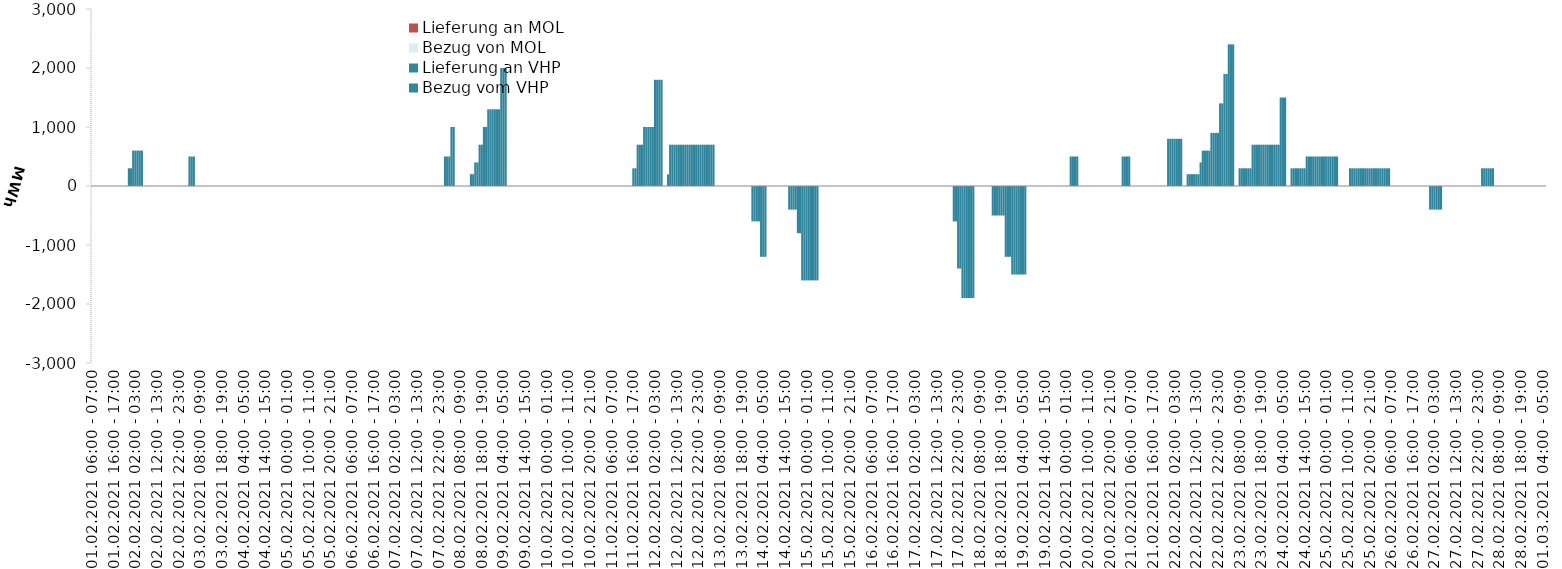
| Category | Bezug vom VHP | Lieferung an VHP | Bezug von MOL | Lieferung an MOL |
|---|---|---|---|---|
| 01.02.2021 06:00 - 07:00 | 0 | 0 | 0 | 0 |
| 01.02.2021 07:00 - 08:00 | 0 | 0 | 0 | 0 |
| 01.02.2021 08:00 - 09:00 | 0 | 0 | 0 | 0 |
| 01.02.2021 09:00 - 10:00 | 0 | 0 | 0 | 0 |
| 01.02.2021 10:00 - 11:00 | 0 | 0 | 0 | 0 |
| 01.02.2021 11:00 - 12:00 | 0 | 0 | 0 | 0 |
| 01.02.2021 12:00 - 13:00 | 0 | 0 | 0 | 0 |
| 01.02.2021 13:00 - 14:00 | 0 | 0 | 0 | 0 |
| 01.02.2021 14:00 - 15:00 | 0 | 0 | 0 | 0 |
| 01.02.2021 15:00 - 16:00 | 0 | 0 | 0 | 0 |
| 01.02.2021 16:00 - 17:00 | 0 | 0 | 0 | 0 |
| 01.02.2021 17:00 - 18:00 | 0 | 0 | 0 | 0 |
| 01.02.2021 18:00 - 19:00 | 0 | 0 | 0 | 0 |
| 01.02.2021 19:00 - 20:00 | 0 | 0 | 0 | 0 |
| 01.02.2021 20:00 - 21:00 | 0 | 0 | 0 | 0 |
| 01.02.2021 21:00 - 22:00 | 0 | 0 | 0 | 0 |
| 01.02.2021 22:00 - 23:00 | 0 | 0 | 0 | 0 |
| 01.02.2021 23:00 - 24:00 | 300 | 0 | 0 | 0 |
| 02.02.2021 00:00 - 01:00 | 300 | 0 | 0 | 0 |
| 02.02.2021 01:00 - 02:00 | 600 | 0 | 0 | 0 |
| 02.02.2021 02:00 - 03:00 | 600 | 0 | 0 | 0 |
| 02.02.2021 03:00 - 04:00 | 600 | 0 | 0 | 0 |
| 02.02.2021 04:00 - 05:00 | 600 | 0 | 0 | 0 |
| 02.02.2021 05:00 - 06:00 | 600 | 0 | 0 | 0 |
| 02.02.2021 06:00 - 07:00 | 0 | 0 | 0 | 0 |
| 02.02.2021 07:00 - 08:00 | 0 | 0 | 0 | 0 |
| 02.02.2021 08:00 - 09:00 | 0 | 0 | 0 | 0 |
| 02.02.2021 09:00 - 10:00 | 0 | 0 | 0 | 0 |
| 02.02.2021 10:00 - 11:00 | 0 | 0 | 0 | 0 |
| 02.02.2021 11:00 - 12:00 | 0 | 0 | 0 | 0 |
| 02.02.2021 12:00 - 13:00 | 0 | 0 | 0 | 0 |
| 02.02.2021 13:00 - 14:00 | 0 | 0 | 0 | 0 |
| 02.02.2021 14:00 - 15:00 | 0 | 0 | 0 | 0 |
| 02.02.2021 15:00 - 16:00 | 0 | 0 | 0 | 0 |
| 02.02.2021 16:00 - 17:00 | 0 | 0 | 0 | 0 |
| 02.02.2021 17:00 - 18:00 | 0 | 0 | 0 | 0 |
| 02.02.2021 18:00 - 19:00 | 0 | 0 | 0 | 0 |
| 02.02.2021 19:00 - 20:00 | 0 | 0 | 0 | 0 |
| 02.02.2021 20:00 - 21:00 | 0 | 0 | 0 | 0 |
| 02.02.2021 21:00 - 22:00 | 0 | 0 | 0 | 0 |
| 02.02.2021 22:00 - 23:00 | 0 | 0 | 0 | 0 |
| 02.02.2021 23:00 - 24:00 | 0 | 0 | 0 | 0 |
| 03.02.2021 00:00 - 01:00 | 0 | 0 | 0 | 0 |
| 03.02.2021 01:00 - 02:00 | 0 | 0 | 0 | 0 |
| 03.02.2021 02:00 - 03:00 | 0 | 0 | 0 | 0 |
| 03.02.2021 03:00 - 04:00 | 500 | 0 | 0 | 0 |
| 03.02.2021 04:00 - 05:00 | 500 | 0 | 0 | 0 |
| 03.02.2021 05:00 - 06:00 | 500 | 0 | 0 | 0 |
| 03.02.2021 06:00 - 07:00 | 0 | 0 | 0 | 0 |
| 03.02.2021 07:00 - 08:00 | 0 | 0 | 0 | 0 |
| 03.02.2021 08:00 - 09:00 | 0 | 0 | 0 | 0 |
| 03.02.2021 09:00 - 10:00 | 0 | 0 | 0 | 0 |
| 03.02.2021 10:00 - 11:00 | 0 | 0 | 0 | 0 |
| 03.02.2021 11:00 - 12:00 | 0 | 0 | 0 | 0 |
| 03.02.2021 12:00 - 13:00 | 0 | 0 | 0 | 0 |
| 03.02.2021 13:00 - 14:00 | 0 | 0 | 0 | 0 |
| 03.02.2021 14:00 - 15:00 | 0 | 0 | 0 | 0 |
| 03.02.2021 15:00 - 16:00 | 0 | 0 | 0 | 0 |
| 03.02.2021 16:00 - 17:00 | 0 | 0 | 0 | 0 |
| 03.02.2021 17:00 - 18:00 | 0 | 0 | 0 | 0 |
| 03.02.2021 18:00 - 19:00 | 0 | 0 | 0 | 0 |
| 03.02.2021 19:00 - 20:00 | 0 | 0 | 0 | 0 |
| 03.02.2021 20:00 - 21:00 | 0 | 0 | 0 | 0 |
| 03.02.2021 21:00 - 22:00 | 0 | 0 | 0 | 0 |
| 03.02.2021 22:00 - 23:00 | 0 | 0 | 0 | 0 |
| 03.02.2021 23:00 - 24:00 | 0 | 0 | 0 | 0 |
| 04.02.2021 00:00 - 01:00 | 0 | 0 | 0 | 0 |
| 04.02.2021 01:00 - 02:00 | 0 | 0 | 0 | 0 |
| 04.02.2021 02:00 - 03:00 | 0 | 0 | 0 | 0 |
| 04.02.2021 03:00 - 04:00 | 0 | 0 | 0 | 0 |
| 04.02.2021 04:00 - 05:00 | 0 | 0 | 0 | 0 |
| 04.02.2021 05:00 - 06:00 | 0 | 0 | 0 | 0 |
| 04.02.2021 06:00 - 07:00 | 0 | 0 | 0 | 0 |
| 04.02.2021 07:00 - 08:00 | 0 | 0 | 0 | 0 |
| 04.02.2021 08:00 - 09:00 | 0 | 0 | 0 | 0 |
| 04.02.2021 09:00 - 10:00 | 0 | 0 | 0 | 0 |
| 04.02.2021 10:00 - 11:00 | 0 | 0 | 0 | 0 |
| 04.02.2021 11:00 - 12:00 | 0 | 0 | 0 | 0 |
| 04.02.2021 12:00 - 13:00 | 0 | 0 | 0 | 0 |
| 04.02.2021 13:00 - 14:00 | 0 | 0 | 0 | 0 |
| 04.02.2021 14:00 - 15:00 | 0 | 0 | 0 | 0 |
| 04.02.2021 15:00 - 16:00 | 0 | 0 | 0 | 0 |
| 04.02.2021 16:00 - 17:00 | 0 | 0 | 0 | 0 |
| 04.02.2021 17:00 - 18:00 | 0 | 0 | 0 | 0 |
| 04.02.2021 18:00 - 19:00 | 0 | 0 | 0 | 0 |
| 04.02.2021 19:00 - 20:00 | 0 | 0 | 0 | 0 |
| 04.02.2021 20:00 - 21:00 | 0 | 0 | 0 | 0 |
| 04.02.2021 21:00 - 22:00 | 0 | 0 | 0 | 0 |
| 04.02.2021 22:00 - 23:00 | 0 | 0 | 0 | 0 |
| 04.02.2021 23:00 - 24:00 | 0 | 0 | 0 | 0 |
| 05.02.2021 00:00 - 01:00 | 0 | 0 | 0 | 0 |
| 05.02.2021 01:00 - 02:00 | 0 | 0 | 0 | 0 |
| 05.02.2021 02:00 - 03:00 | 0 | 0 | 0 | 0 |
| 05.02.2021 03:00 - 04:00 | 0 | 0 | 0 | 0 |
| 05.02.2021 04:00 - 05:00 | 0 | 0 | 0 | 0 |
| 05.02.2021 05:00 - 06:00 | 0 | 0 | 0 | 0 |
| 05.02.2021 06:00 - 07:00 | 0 | 0 | 0 | 0 |
| 05.02.2021 07:00 - 08:00 | 0 | 0 | 0 | 0 |
| 05.02.2021 08:00 - 09:00 | 0 | 0 | 0 | 0 |
| 05.02.2021 09:00 - 10:00 | 0 | 0 | 0 | 0 |
| 05.02.2021 10:00 - 11:00 | 0 | 0 | 0 | 0 |
| 05.02.2021 11:00 - 12:00 | 0 | 0 | 0 | 0 |
| 05.02.2021 12:00 - 13:00 | 0 | 0 | 0 | 0 |
| 05.02.2021 13:00 - 14:00 | 0 | 0 | 0 | 0 |
| 05.02.2021 14:00 - 15:00 | 0 | 0 | 0 | 0 |
| 05.02.2021 15:00 - 16:00 | 0 | 0 | 0 | 0 |
| 05.02.2021 16:00 - 17:00 | 0 | 0 | 0 | 0 |
| 05.02.2021 17:00 - 18:00 | 0 | 0 | 0 | 0 |
| 05.02.2021 18:00 - 19:00 | 0 | 0 | 0 | 0 |
| 05.02.2021 19:00 - 20:00 | 0 | 0 | 0 | 0 |
| 05.02.2021 20:00 - 21:00 | 0 | 0 | 0 | 0 |
| 05.02.2021 21:00 - 22:00 | 0 | 0 | 0 | 0 |
| 05.02.2021 22:00 - 23:00 | 0 | 0 | 0 | 0 |
| 05.02.2021 23:00 - 24:00 | 0 | 0 | 0 | 0 |
| 06.02.2021 00:00 - 01:00 | 0 | 0 | 0 | 0 |
| 06.02.2021 01:00 - 02:00 | 0 | 0 | 0 | 0 |
| 06.02.2021 02:00 - 03:00 | 0 | 0 | 0 | 0 |
| 06.02.2021 03:00 - 04:00 | 0 | 0 | 0 | 0 |
| 06.02.2021 04:00 - 05:00 | 0 | 0 | 0 | 0 |
| 06.02.2021 05:00 - 06:00 | 0 | 0 | 0 | 0 |
| 06.02.2021 06:00 - 07:00 | 0 | 0 | 0 | 0 |
| 06.02.2021 07:00 - 08:00 | 0 | 0 | 0 | 0 |
| 06.02.2021 08:00 - 09:00 | 0 | 0 | 0 | 0 |
| 06.02.2021 09:00 - 10:00 | 0 | 0 | 0 | 0 |
| 06.02.2021 10:00 - 11:00 | 0 | 0 | 0 | 0 |
| 06.02.2021 11:00 - 12:00 | 0 | 0 | 0 | 0 |
| 06.02.2021 12:00 - 13:00 | 0 | 0 | 0 | 0 |
| 06.02.2021 13:00 - 14:00 | 0 | 0 | 0 | 0 |
| 06.02.2021 14:00 - 15:00 | 0 | 0 | 0 | 0 |
| 06.02.2021 15:00 - 16:00 | 0 | 0 | 0 | 0 |
| 06.02.2021 16:00 - 17:00 | 0 | 0 | 0 | 0 |
| 06.02.2021 17:00 - 18:00 | 0 | 0 | 0 | 0 |
| 06.02.2021 18:00 - 19:00 | 0 | 0 | 0 | 0 |
| 06.02.2021 19:00 - 20:00 | 0 | 0 | 0 | 0 |
| 06.02.2021 20:00 - 21:00 | 0 | 0 | 0 | 0 |
| 06.02.2021 21:00 - 22:00 | 0 | 0 | 0 | 0 |
| 06.02.2021 22:00 - 23:00 | 0 | 0 | 0 | 0 |
| 06.02.2021 23:00 - 24:00 | 0 | 0 | 0 | 0 |
| 07.02.2021 00:00 - 01:00 | 0 | 0 | 0 | 0 |
| 07.02.2021 01:00 - 02:00 | 0 | 0 | 0 | 0 |
| 07.02.2021 02:00 - 03:00 | 0 | 0 | 0 | 0 |
| 07.02.2021 03:00 - 04:00 | 0 | 0 | 0 | 0 |
| 07.02.2021 04:00 - 05:00 | 0 | 0 | 0 | 0 |
| 07.02.2021 05:00 - 06:00 | 0 | 0 | 0 | 0 |
| 07.02.2021 06:00 - 07:00 | 0 | 0 | 0 | 0 |
| 07.02.2021 07:00 - 08:00 | 0 | 0 | 0 | 0 |
| 07.02.2021 08:00 - 09:00 | 0 | 0 | 0 | 0 |
| 07.02.2021 09:00 - 10:00 | 0 | 0 | 0 | 0 |
| 07.02.2021 10:00 - 11:00 | 0 | 0 | 0 | 0 |
| 07.02.2021 11:00 - 12:00 | 0 | 0 | 0 | 0 |
| 07.02.2021 12:00 - 13:00 | 0 | 0 | 0 | 0 |
| 07.02.2021 13:00 - 14:00 | 0 | 0 | 0 | 0 |
| 07.02.2021 14:00 - 15:00 | 0 | 0 | 0 | 0 |
| 07.02.2021 15:00 - 16:00 | 0 | 0 | 0 | 0 |
| 07.02.2021 16:00 - 17:00 | 0 | 0 | 0 | 0 |
| 07.02.2021 17:00 - 18:00 | 0 | 0 | 0 | 0 |
| 07.02.2021 18:00 - 19:00 | 0 | 0 | 0 | 0 |
| 07.02.2021 19:00 - 20:00 | 0 | 0 | 0 | 0 |
| 07.02.2021 20:00 - 21:00 | 0 | 0 | 0 | 0 |
| 07.02.2021 21:00 - 22:00 | 0 | 0 | 0 | 0 |
| 07.02.2021 22:00 - 23:00 | 0 | 0 | 0 | 0 |
| 07.02.2021 23:00 - 24:00 | 0 | 0 | 0 | 0 |
| 08.02.2021 00:00 - 01:00 | 0 | 0 | 0 | 0 |
| 08.02.2021 01:00 - 02:00 | 500 | 0 | 0 | 0 |
| 08.02.2021 02:00 - 03:00 | 500 | 0 | 0 | 0 |
| 08.02.2021 03:00 - 04:00 | 500 | 0 | 0 | 0 |
| 08.02.2021 04:00 - 05:00 | 1000 | 0 | 0 | 0 |
| 08.02.2021 05:00 - 06:00 | 1000 | 0 | 0 | 0 |
| 08.02.2021 06:00 - 07:00 | 0 | 0 | 0 | 0 |
| 08.02.2021 07:00 - 08:00 | 0 | 0 | 0 | 0 |
| 08.02.2021 08:00 - 09:00 | 0 | 0 | 0 | 0 |
| 08.02.2021 09:00 - 10:00 | 0 | 0 | 0 | 0 |
| 08.02.2021 10:00 - 11:00 | 0 | 0 | 0 | 0 |
| 08.02.2021 11:00 - 12:00 | 0 | 0 | 0 | 0 |
| 08.02.2021 12:00 - 13:00 | 0 | 0 | 0 | 0 |
| 08.02.2021 13:00 - 14:00 | 200 | 0 | 0 | 0 |
| 08.02.2021 14:00 - 15:00 | 200 | 0 | 0 | 0 |
| 08.02.2021 15:00 - 16:00 | 400 | 0 | 0 | 0 |
| 08.02.2021 16:00 - 17:00 | 400 | 0 | 0 | 0 |
| 08.02.2021 17:00 - 18:00 | 700 | 0 | 0 | 0 |
| 08.02.2021 18:00 - 19:00 | 700 | 0 | 0 | 0 |
| 08.02.2021 19:00 - 20:00 | 1000 | 0 | 0 | 0 |
| 08.02.2021 20:00 - 21:00 | 1000 | 0 | 0 | 0 |
| 08.02.2021 21:00 - 22:00 | 1300 | 0 | 0 | 0 |
| 08.02.2021 22:00 - 23:00 | 1300 | 0 | 0 | 0 |
| 08.02.2021 23:00 - 24:00 | 1300 | 0 | 0 | 0 |
| 09.02.2021 00:00 - 01:00 | 1300 | 0 | 0 | 0 |
| 09.02.2021 01:00 - 02:00 | 1300 | 0 | 0 | 0 |
| 09.02.2021 02:00 - 03:00 | 1300 | 0 | 0 | 0 |
| 09.02.2021 03:00 - 04:00 | 2000 | 0 | 0 | 0 |
| 09.02.2021 04:00 - 05:00 | 2000 | 0 | 0 | 0 |
| 09.02.2021 05:00 - 06:00 | 2000 | 0 | 0 | 0 |
| 09.02.2021 06:00 - 07:00 | 0 | 0 | 0 | 0 |
| 09.02.2021 07:00 - 08:00 | 0 | 0 | 0 | 0 |
| 09.02.2021 08:00 - 09:00 | 0 | 0 | 0 | 0 |
| 09.02.2021 09:00 - 10:00 | 0 | 0 | 0 | 0 |
| 09.02.2021 10:00 - 11:00 | 0 | 0 | 0 | 0 |
| 09.02.2021 11:00 - 12:00 | 0 | 0 | 0 | 0 |
| 09.02.2021 12:00 - 13:00 | 0 | 0 | 0 | 0 |
| 09.02.2021 13:00 - 14:00 | 0 | 0 | 0 | 0 |
| 09.02.2021 14:00 - 15:00 | 0 | 0 | 0 | 0 |
| 09.02.2021 15:00 - 16:00 | 0 | 0 | 0 | 0 |
| 09.02.2021 16:00 - 17:00 | 0 | 0 | 0 | 0 |
| 09.02.2021 17:00 - 18:00 | 0 | 0 | 0 | 0 |
| 09.02.2021 18:00 - 19:00 | 0 | 0 | 0 | 0 |
| 09.02.2021 19:00 - 20:00 | 0 | 0 | 0 | 0 |
| 09.02.2021 20:00 - 21:00 | 0 | 0 | 0 | 0 |
| 09.02.2021 21:00 - 22:00 | 0 | 0 | 0 | 0 |
| 09.02.2021 22:00 - 23:00 | 0 | 0 | 0 | 0 |
| 09.02.2021 23:00 - 24:00 | 0 | 0 | 0 | 0 |
| 10.02.2021 00:00 - 01:00 | 0 | 0 | 0 | 0 |
| 10.02.2021 01:00 - 02:00 | 0 | 0 | 0 | 0 |
| 10.02.2021 02:00 - 03:00 | 0 | 0 | 0 | 0 |
| 10.02.2021 03:00 - 04:00 | 0 | 0 | 0 | 0 |
| 10.02.2021 04:00 - 05:00 | 0 | 0 | 0 | 0 |
| 10.02.2021 05:00 - 06:00 | 0 | 0 | 0 | 0 |
| 10.02.2021 06:00 - 07:00 | 0 | 0 | 0 | 0 |
| 10.02.2021 07:00 - 08:00 | 0 | 0 | 0 | 0 |
| 10.02.2021 08:00 - 09:00 | 0 | 0 | 0 | 0 |
| 10.02.2021 09:00 - 10:00 | 0 | 0 | 0 | 0 |
| 10.02.2021 10:00 - 11:00 | 0 | 0 | 0 | 0 |
| 10.02.2021 11:00 - 12:00 | 0 | 0 | 0 | 0 |
| 10.02.2021 12:00 - 13:00 | 0 | 0 | 0 | 0 |
| 10.02.2021 13:00 - 14:00 | 0 | 0 | 0 | 0 |
| 10.02.2021 14:00 - 15:00 | 0 | 0 | 0 | 0 |
| 10.02.2021 15:00 - 16:00 | 0 | 0 | 0 | 0 |
| 10.02.2021 16:00 - 17:00 | 0 | 0 | 0 | 0 |
| 10.02.2021 17:00 - 18:00 | 0 | 0 | 0 | 0 |
| 10.02.2021 18:00 - 19:00 | 0 | 0 | 0 | 0 |
| 10.02.2021 19:00 - 20:00 | 0 | 0 | 0 | 0 |
| 10.02.2021 20:00 - 21:00 | 0 | 0 | 0 | 0 |
| 10.02.2021 21:00 - 22:00 | 0 | 0 | 0 | 0 |
| 10.02.2021 22:00 - 23:00 | 0 | 0 | 0 | 0 |
| 10.02.2021 23:00 - 24:00 | 0 | 0 | 0 | 0 |
| 11.02.2021 00:00 - 01:00 | 0 | 0 | 0 | 0 |
| 11.02.2021 01:00 - 02:00 | 0 | 0 | 0 | 0 |
| 11.02.2021 02:00 - 03:00 | 0 | 0 | 0 | 0 |
| 11.02.2021 03:00 - 04:00 | 0 | 0 | 0 | 0 |
| 11.02.2021 04:00 - 05:00 | 0 | 0 | 0 | 0 |
| 11.02.2021 05:00 - 06:00 | 0 | 0 | 0 | 0 |
| 11.02.2021 06:00 - 07:00 | 0 | 0 | 0 | 0 |
| 11.02.2021 07:00 - 08:00 | 0 | 0 | 0 | 0 |
| 11.02.2021 08:00 - 09:00 | 0 | 0 | 0 | 0 |
| 11.02.2021 09:00 - 10:00 | 0 | 0 | 0 | 0 |
| 11.02.2021 10:00 - 11:00 | 0 | 0 | 0 | 0 |
| 11.02.2021 11:00 - 12:00 | 0 | 0 | 0 | 0 |
| 11.02.2021 12:00 - 13:00 | 0 | 0 | 0 | 0 |
| 11.02.2021 13:00 - 14:00 | 0 | 0 | 0 | 0 |
| 11.02.2021 14:00 - 15:00 | 0 | 0 | 0 | 0 |
| 11.02.2021 15:00 - 16:00 | 0 | 0 | 0 | 0 |
| 11.02.2021 16:00 - 17:00 | 300 | 0 | 0 | 0 |
| 11.02.2021 17:00 - 18:00 | 300 | 0 | 0 | 0 |
| 11.02.2021 18:00 - 19:00 | 700 | 0 | 0 | 0 |
| 11.02.2021 19:00 - 20:00 | 700 | 0 | 0 | 0 |
| 11.02.2021 20:00 - 21:00 | 700 | 0 | 0 | 0 |
| 11.02.2021 21:00 - 22:00 | 1000 | 0 | 0 | 0 |
| 11.02.2021 22:00 - 23:00 | 1000 | 0 | 0 | 0 |
| 11.02.2021 23:00 - 24:00 | 1000 | 0 | 0 | 0 |
| 12.02.2021 00:00 - 01:00 | 1000 | 0 | 0 | 0 |
| 12.02.2021 01:00 - 02:00 | 1000 | 0 | 0 | 0 |
| 12.02.2021 02:00 - 03:00 | 1800 | 0 | 0 | 0 |
| 12.02.2021 03:00 - 04:00 | 1800 | 0 | 0 | 0 |
| 12.02.2021 04:00 - 05:00 | 1800 | 0 | 0 | 0 |
| 12.02.2021 05:00 - 06:00 | 1800 | 0 | 0 | 0 |
| 12.02.2021 06:00 - 07:00 | 0 | 0 | 0 | 0 |
| 12.02.2021 07:00 - 08:00 | 0 | 0 | 0 | 0 |
| 12.02.2021 08:00 - 09:00 | 196 | 0 | 0 | 0 |
| 12.02.2021 09:00 - 10:00 | 700 | 0 | 0 | 0 |
| 12.02.2021 10:00 - 11:00 | 700 | 0 | 0 | 0 |
| 12.02.2021 11:00 - 12:00 | 700 | 0 | 0 | 0 |
| 12.02.2021 12:00 - 13:00 | 700 | 0 | 0 | 0 |
| 12.02.2021 13:00 - 14:00 | 700 | 0 | 0 | 0 |
| 12.02.2021 14:00 - 15:00 | 700 | 0 | 0 | 0 |
| 12.02.2021 15:00 - 16:00 | 700 | 0 | 0 | 0 |
| 12.02.2021 16:00 - 17:00 | 700 | 0 | 0 | 0 |
| 12.02.2021 17:00 - 18:00 | 700 | 0 | 0 | 0 |
| 12.02.2021 18:00 - 19:00 | 700 | 0 | 0 | 0 |
| 12.02.2021 19:00 - 20:00 | 700 | 0 | 0 | 0 |
| 12.02.2021 20:00 - 21:00 | 700 | 0 | 0 | 0 |
| 12.02.2021 21:00 - 22:00 | 700 | 0 | 0 | 0 |
| 12.02.2021 22:00 - 23:00 | 700 | 0 | 0 | 0 |
| 12.02.2021 23:00 - 24:00 | 700 | 0 | 0 | 0 |
| 13.02.2021 00:00 - 01:00 | 700 | 0 | 0 | 0 |
| 13.02.2021 01:00 - 02:00 | 700 | 0 | 0 | 0 |
| 13.02.2021 02:00 - 03:00 | 700 | 0 | 0 | 0 |
| 13.02.2021 03:00 - 04:00 | 700 | 0 | 0 | 0 |
| 13.02.2021 04:00 - 05:00 | 700 | 0 | 0 | 0 |
| 13.02.2021 05:00 - 06:00 | 700 | 0 | 0 | 0 |
| 13.02.2021 06:00 - 07:00 | 0 | 0 | 0 | 0 |
| 13.02.2021 07:00 - 08:00 | 0 | 0 | 0 | 0 |
| 13.02.2021 08:00 - 09:00 | 0 | 0 | 0 | 0 |
| 13.02.2021 09:00 - 10:00 | 0 | 0 | 0 | 0 |
| 13.02.2021 10:00 - 11:00 | 0 | 0 | 0 | 0 |
| 13.02.2021 11:00 - 12:00 | 0 | 0 | 0 | 0 |
| 13.02.2021 12:00 - 13:00 | 0 | 0 | 0 | 0 |
| 13.02.2021 13:00 - 14:00 | 0 | 0 | 0 | 0 |
| 13.02.2021 14:00 - 15:00 | 0 | 0 | 0 | 0 |
| 13.02.2021 15:00 - 16:00 | 0 | 0 | 0 | 0 |
| 13.02.2021 16:00 - 17:00 | 0 | 0 | 0 | 0 |
| 13.02.2021 17:00 - 18:00 | 0 | 0 | 0 | 0 |
| 13.02.2021 18:00 - 19:00 | 0 | 0 | 0 | 0 |
| 13.02.2021 19:00 - 20:00 | 0 | 0 | 0 | 0 |
| 13.02.2021 20:00 - 21:00 | 0 | 0 | 0 | 0 |
| 13.02.2021 21:00 - 22:00 | 0 | 0 | 0 | 0 |
| 13.02.2021 22:00 - 23:00 | 0 | 0 | 0 | 0 |
| 13.02.2021 23:00 - 24:00 | 0 | -600 | 0 | 0 |
| 14.02.2021 00:00 - 01:00 | 0 | -600 | 0 | 0 |
| 14.02.2021 01:00 - 02:00 | 0 | -600 | 0 | 0 |
| 14.02.2021 02:00 - 03:00 | 0 | -600 | 0 | 0 |
| 14.02.2021 03:00 - 04:00 | 0 | -1200 | 0 | 0 |
| 14.02.2021 04:00 - 05:00 | 0 | -1200 | 0 | 0 |
| 14.02.2021 05:00 - 06:00 | 0 | -1200 | 0 | 0 |
| 14.02.2021 06:00 - 07:00 | 0 | 0 | 0 | 0 |
| 14.02.2021 07:00 - 08:00 | 0 | 0 | 0 | 0 |
| 14.02.2021 08:00 - 09:00 | 0 | 0 | 0 | 0 |
| 14.02.2021 09:00 - 10:00 | 0 | 0 | 0 | 0 |
| 14.02.2021 10:00 - 11:00 | 0 | 0 | 0 | 0 |
| 14.02.2021 11:00 - 12:00 | 0 | 0 | 0 | 0 |
| 14.02.2021 12:00 - 13:00 | 0 | 0 | 0 | 0 |
| 14.02.2021 13:00 - 14:00 | 0 | 0 | 0 | 0 |
| 14.02.2021 14:00 - 15:00 | 0 | 0 | 0 | 0 |
| 14.02.2021 15:00 - 16:00 | 0 | 0 | 0 | 0 |
| 14.02.2021 16:00 - 17:00 | 0 | -400 | 0 | 0 |
| 14.02.2021 17:00 - 18:00 | 0 | -400 | 0 | 0 |
| 14.02.2021 18:00 - 19:00 | 0 | -400 | 0 | 0 |
| 14.02.2021 19:00 - 20:00 | 0 | -400 | 0 | 0 |
| 14.02.2021 20:00 - 21:00 | 0 | -800 | 0 | 0 |
| 14.02.2021 21:00 - 22:00 | 0 | -800 | 0 | 0 |
| 14.02.2021 22:00 - 23:00 | 0 | -1600 | 0 | 0 |
| 14.02.2021 23:00 - 24:00 | 0 | -1600 | 0 | 0 |
| 15.02.2021 00:00 - 01:00 | 0 | -1600 | 0 | 0 |
| 15.02.2021 01:00 - 02:00 | 0 | -1600 | 0 | 0 |
| 15.02.2021 02:00 - 03:00 | 0 | -1600 | 0 | 0 |
| 15.02.2021 03:00 - 04:00 | 0 | -1600 | 0 | 0 |
| 15.02.2021 04:00 - 05:00 | 0 | -1600 | 0 | 0 |
| 15.02.2021 05:00 - 06:00 | 0 | -1600 | 0 | 0 |
| 15.02.2021 06:00 - 07:00 | 0 | 0 | 0 | 0 |
| 15.02.2021 07:00 - 08:00 | 0 | 0 | 0 | 0 |
| 15.02.2021 08:00 - 09:00 | 0 | 0 | 0 | 0 |
| 15.02.2021 09:00 - 10:00 | 0 | 0 | 0 | 0 |
| 15.02.2021 10:00 - 11:00 | 0 | 0 | 0 | 0 |
| 15.02.2021 11:00 - 12:00 | 0 | 0 | 0 | 0 |
| 15.02.2021 12:00 - 13:00 | 0 | 0 | 0 | 0 |
| 15.02.2021 13:00 - 14:00 | 0 | 0 | 0 | 0 |
| 15.02.2021 14:00 - 15:00 | 0 | 0 | 0 | 0 |
| 15.02.2021 15:00 - 16:00 | 0 | 0 | 0 | 0 |
| 15.02.2021 16:00 - 17:00 | 0 | 0 | 0 | 0 |
| 15.02.2021 17:00 - 18:00 | 0 | 0 | 0 | 0 |
| 15.02.2021 18:00 - 19:00 | 0 | 0 | 0 | 0 |
| 15.02.2021 19:00 - 20:00 | 0 | 0 | 0 | 0 |
| 15.02.2021 20:00 - 21:00 | 0 | 0 | 0 | 0 |
| 15.02.2021 21:00 - 22:00 | 0 | 0 | 0 | 0 |
| 15.02.2021 22:00 - 23:00 | 0 | 0 | 0 | 0 |
| 15.02.2021 23:00 - 24:00 | 0 | 0 | 0 | 0 |
| 16.02.2021 00:00 - 01:00 | 0 | 0 | 0 | 0 |
| 16.02.2021 01:00 - 02:00 | 0 | 0 | 0 | 0 |
| 16.02.2021 02:00 - 03:00 | 0 | 0 | 0 | 0 |
| 16.02.2021 03:00 - 04:00 | 0 | 0 | 0 | 0 |
| 16.02.2021 04:00 - 05:00 | 0 | 0 | 0 | 0 |
| 16.02.2021 05:00 - 06:00 | 0 | 0 | 0 | 0 |
| 16.02.2021 06:00 - 07:00 | 0 | 0 | 0 | 0 |
| 16.02.2021 07:00 - 08:00 | 0 | 0 | 0 | 0 |
| 16.02.2021 08:00 - 09:00 | 0 | 0 | 0 | 0 |
| 16.02.2021 09:00 - 10:00 | 0 | 0 | 0 | 0 |
| 16.02.2021 10:00 - 11:00 | 0 | 0 | 0 | 0 |
| 16.02.2021 11:00 - 12:00 | 0 | 0 | 0 | 0 |
| 16.02.2021 12:00 - 13:00 | 0 | 0 | 0 | 0 |
| 16.02.2021 13:00 - 14:00 | 0 | 0 | 0 | 0 |
| 16.02.2021 14:00 - 15:00 | 0 | 0 | 0 | 0 |
| 16.02.2021 15:00 - 16:00 | 0 | 0 | 0 | 0 |
| 16.02.2021 16:00 - 17:00 | 0 | 0 | 0 | 0 |
| 16.02.2021 17:00 - 18:00 | 0 | 0 | 0 | 0 |
| 16.02.2021 18:00 - 19:00 | 0 | 0 | 0 | 0 |
| 16.02.2021 19:00 - 20:00 | 0 | 0 | 0 | 0 |
| 16.02.2021 20:00 - 21:00 | 0 | 0 | 0 | 0 |
| 16.02.2021 21:00 - 22:00 | 0 | 0 | 0 | 0 |
| 16.02.2021 22:00 - 23:00 | 0 | 0 | 0 | 0 |
| 16.02.2021 23:00 - 24:00 | 0 | 0 | 0 | 0 |
| 17.02.2021 00:00 - 01:00 | 0 | 0 | 0 | 0 |
| 17.02.2021 01:00 - 02:00 | 0 | 0 | 0 | 0 |
| 17.02.2021 02:00 - 03:00 | 0 | 0 | 0 | 0 |
| 17.02.2021 03:00 - 04:00 | 0 | 0 | 0 | 0 |
| 17.02.2021 04:00 - 05:00 | 0 | 0 | 0 | 0 |
| 17.02.2021 05:00 - 06:00 | 0 | 0 | 0 | 0 |
| 17.02.2021 06:00 - 07:00 | 0 | 0 | 0 | 0 |
| 17.02.2021 07:00 - 08:00 | 0 | 0 | 0 | 0 |
| 17.02.2021 08:00 - 09:00 | 0 | 0 | 0 | 0 |
| 17.02.2021 09:00 - 10:00 | 0 | 0 | 0 | 0 |
| 17.02.2021 10:00 - 11:00 | 0 | 0 | 0 | 0 |
| 17.02.2021 11:00 - 12:00 | 0 | 0 | 0 | 0 |
| 17.02.2021 12:00 - 13:00 | 0 | 0 | 0 | 0 |
| 17.02.2021 13:00 - 14:00 | 0 | 0 | 0 | 0 |
| 17.02.2021 14:00 - 15:00 | 0 | 0 | 0 | 0 |
| 17.02.2021 15:00 - 16:00 | 0 | 0 | 0 | 0 |
| 17.02.2021 16:00 - 17:00 | 0 | 0 | 0 | 0 |
| 17.02.2021 17:00 - 18:00 | 0 | 0 | 0 | 0 |
| 17.02.2021 18:00 - 19:00 | 0 | 0 | 0 | 0 |
| 17.02.2021 19:00 - 20:00 | 0 | 0 | 0 | 0 |
| 17.02.2021 20:00 - 21:00 | 0 | -600 | 0 | 0 |
| 17.02.2021 21:00 - 22:00 | 0 | -600 | 0 | 0 |
| 17.02.2021 22:00 - 23:00 | 0 | -1400 | 0 | 0 |
| 17.02.2021 23:00 - 24:00 | 0 | -1400 | 0 | 0 |
| 18.02.2021 00:00 - 01:00 | 0 | -1900 | 0 | 0 |
| 18.02.2021 01:00 - 02:00 | 0 | -1900 | 0 | 0 |
| 18.02.2021 02:00 - 03:00 | 0 | -1900 | 0 | 0 |
| 18.02.2021 03:00 - 04:00 | 0 | -1900 | 0 | 0 |
| 18.02.2021 04:00 - 05:00 | 0 | -1900 | 0 | 0 |
| 18.02.2021 05:00 - 06:00 | 0 | -1900 | 0 | 0 |
| 18.02.2021 06:00 - 07:00 | 0 | 0 | 0 | 0 |
| 18.02.2021 07:00 - 08:00 | 0 | 0 | 0 | 0 |
| 18.02.2021 08:00 - 09:00 | 0 | 0 | 0 | 0 |
| 18.02.2021 09:00 - 10:00 | 0 | 0 | 0 | 0 |
| 18.02.2021 10:00 - 11:00 | 0 | 0 | 0 | 0 |
| 18.02.2021 11:00 - 12:00 | 0 | 0 | 0 | 0 |
| 18.02.2021 12:00 - 13:00 | 0 | 0 | 0 | 0 |
| 18.02.2021 13:00 - 14:00 | 0 | 0 | 0 | 0 |
| 18.02.2021 14:00 - 15:00 | 0 | -500 | 0 | 0 |
| 18.02.2021 15:00 - 16:00 | 0 | -500 | 0 | 0 |
| 18.02.2021 16:00 - 17:00 | 0 | -500 | 0 | 0 |
| 18.02.2021 17:00 - 18:00 | 0 | -500 | 0 | 0 |
| 18.02.2021 18:00 - 19:00 | 0 | -500 | 0 | 0 |
| 18.02.2021 19:00 - 20:00 | 0 | -500 | 0 | 0 |
| 18.02.2021 20:00 - 21:00 | 0 | -1200 | 0 | 0 |
| 18.02.2021 21:00 - 22:00 | 0 | -1200 | 0 | 0 |
| 18.02.2021 22:00 - 23:00 | 0 | -1200 | 0 | 0 |
| 18.02.2021 23:00 - 24:00 | 0 | -1500 | 0 | 0 |
| 19.02.2021 00:00 - 01:00 | 0 | -1500 | 0 | 0 |
| 19.02.2021 01:00 - 02:00 | 0 | -1500 | 0 | 0 |
| 19.02.2021 02:00 - 03:00 | 0 | -1500 | 0 | 0 |
| 19.02.2021 03:00 - 04:00 | 0 | -1500 | 0 | 0 |
| 19.02.2021 04:00 - 05:00 | 0 | -1500 | 0 | 0 |
| 19.02.2021 05:00 - 06:00 | 0 | -1500 | 0 | 0 |
| 19.02.2021 06:00 - 07:00 | 0 | 0 | 0 | 0 |
| 19.02.2021 07:00 - 08:00 | 0 | 0 | 0 | 0 |
| 19.02.2021 08:00 - 09:00 | 0 | 0 | 0 | 0 |
| 19.02.2021 09:00 - 10:00 | 0 | 0 | 0 | 0 |
| 19.02.2021 10:00 - 11:00 | 0 | 0 | 0 | 0 |
| 19.02.2021 11:00 - 12:00 | 0 | 0 | 0 | 0 |
| 19.02.2021 12:00 - 13:00 | 0 | 0 | 0 | 0 |
| 19.02.2021 13:00 - 14:00 | 0 | 0 | 0 | 0 |
| 19.02.2021 14:00 - 15:00 | 0 | 0 | 0 | 0 |
| 19.02.2021 15:00 - 16:00 | 0 | 0 | 0 | 0 |
| 19.02.2021 16:00 - 17:00 | 0 | 0 | 0 | 0 |
| 19.02.2021 17:00 - 18:00 | 0 | 0 | 0 | 0 |
| 19.02.2021 18:00 - 19:00 | 0 | 0 | 0 | 0 |
| 19.02.2021 19:00 - 20:00 | 0 | 0 | 0 | 0 |
| 19.02.2021 20:00 - 21:00 | 0 | 0 | 0 | 0 |
| 19.02.2021 21:00 - 22:00 | 0 | 0 | 0 | 0 |
| 19.02.2021 22:00 - 23:00 | 0 | 0 | 0 | 0 |
| 19.02.2021 23:00 - 24:00 | 0 | 0 | 0 | 0 |
| 20.02.2021 00:00 - 01:00 | 0 | 0 | 0 | 0 |
| 20.02.2021 01:00 - 02:00 | 0 | 0 | 0 | 0 |
| 20.02.2021 02:00 - 03:00 | 500 | 0 | 0 | 0 |
| 20.02.2021 03:00 - 04:00 | 500 | 0 | 0 | 0 |
| 20.02.2021 04:00 - 05:00 | 500 | 0 | 0 | 0 |
| 20.02.2021 05:00 - 06:00 | 500 | 0 | 0 | 0 |
| 20.02.2021 06:00 - 07:00 | 0 | 0 | 0 | 0 |
| 20.02.2021 07:00 - 08:00 | 0 | 0 | 0 | 0 |
| 20.02.2021 08:00 - 09:00 | 0 | 0 | 0 | 0 |
| 20.02.2021 09:00 - 10:00 | 0 | 0 | 0 | 0 |
| 20.02.2021 10:00 - 11:00 | 0 | 0 | 0 | 0 |
| 20.02.2021 11:00 - 12:00 | 0 | 0 | 0 | 0 |
| 20.02.2021 12:00 - 13:00 | 0 | 0 | 0 | 0 |
| 20.02.2021 13:00 - 14:00 | 0 | 0 | 0 | 0 |
| 20.02.2021 14:00 - 15:00 | 0 | 0 | 0 | 0 |
| 20.02.2021 15:00 - 16:00 | 0 | 0 | 0 | 0 |
| 20.02.2021 16:00 - 17:00 | 0 | 0 | 0 | 0 |
| 20.02.2021 17:00 - 18:00 | 0 | 0 | 0 | 0 |
| 20.02.2021 18:00 - 19:00 | 0 | 0 | 0 | 0 |
| 20.02.2021 19:00 - 20:00 | 0 | 0 | 0 | 0 |
| 20.02.2021 20:00 - 21:00 | 0 | 0 | 0 | 0 |
| 20.02.2021 21:00 - 22:00 | 0 | 0 | 0 | 0 |
| 20.02.2021 22:00 - 23:00 | 0 | 0 | 0 | 0 |
| 20.02.2021 23:00 - 24:00 | 0 | 0 | 0 | 0 |
| 21.02.2021 00:00 - 01:00 | 0 | 0 | 0 | 0 |
| 21.02.2021 01:00 - 02:00 | 0 | 0 | 0 | 0 |
| 21.02.2021 02:00 - 03:00 | 500 | 0 | 0 | 0 |
| 21.02.2021 03:00 - 04:00 | 500 | 0 | 0 | 0 |
| 21.02.2021 04:00 - 05:00 | 500 | 0 | 0 | 0 |
| 21.02.2021 05:00 - 06:00 | 500 | 0 | 0 | 0 |
| 21.02.2021 06:00 - 07:00 | 0 | 0 | 0 | 0 |
| 21.02.2021 07:00 - 08:00 | 0 | 0 | 0 | 0 |
| 21.02.2021 08:00 - 09:00 | 0 | 0 | 0 | 0 |
| 21.02.2021 09:00 - 10:00 | 0 | 0 | 0 | 0 |
| 21.02.2021 10:00 - 11:00 | 0 | 0 | 0 | 0 |
| 21.02.2021 11:00 - 12:00 | 0 | 0 | 0 | 0 |
| 21.02.2021 12:00 - 13:00 | 0 | 0 | 0 | 0 |
| 21.02.2021 13:00 - 14:00 | 0 | 0 | 0 | 0 |
| 21.02.2021 14:00 - 15:00 | 0 | 0 | 0 | 0 |
| 21.02.2021 15:00 - 16:00 | 0 | 0 | 0 | 0 |
| 21.02.2021 16:00 - 17:00 | 0 | 0 | 0 | 0 |
| 21.02.2021 17:00 - 18:00 | 0 | 0 | 0 | 0 |
| 21.02.2021 18:00 - 19:00 | 0 | 0 | 0 | 0 |
| 21.02.2021 19:00 - 20:00 | 0 | 0 | 0 | 0 |
| 21.02.2021 20:00 - 21:00 | 0 | 0 | 0 | 0 |
| 21.02.2021 21:00 - 22:00 | 0 | 0 | 0 | 0 |
| 21.02.2021 22:00 - 23:00 | 0 | 0 | 0 | 0 |
| 21.02.2021 23:00 - 24:00 | 800 | 0 | 0 | 0 |
| 22.02.2021 00:00 - 01:00 | 800 | 0 | 0 | 0 |
| 22.02.2021 01:00 - 02:00 | 800 | 0 | 0 | 0 |
| 22.02.2021 02:00 - 03:00 | 800 | 0 | 0 | 0 |
| 22.02.2021 03:00 - 04:00 | 800 | 0 | 0 | 0 |
| 22.02.2021 04:00 - 05:00 | 800 | 0 | 0 | 0 |
| 22.02.2021 05:00 - 06:00 | 800 | 0 | 0 | 0 |
| 22.02.2021 06:00 - 07:00 | 0 | 0 | 0 | 0 |
| 22.02.2021 07:00 - 08:00 | 0 | 0 | 0 | 0 |
| 22.02.2021 08:00 - 09:00 | 200 | 0 | 0 | 0 |
| 22.02.2021 09:00 - 10:00 | 200 | 0 | 0 | 0 |
| 22.02.2021 10:00 - 11:00 | 200 | 0 | 0 | 0 |
| 22.02.2021 11:00 - 12:00 | 200 | 0 | 0 | 0 |
| 22.02.2021 12:00 - 13:00 | 200 | 0 | 0 | 0 |
| 22.02.2021 13:00 - 14:00 | 200 | 0 | 0 | 0 |
| 22.02.2021 14:00 - 15:00 | 400 | 0 | 0 | 0 |
| 22.02.2021 15:00 - 16:00 | 600 | 0 | 0 | 0 |
| 22.02.2021 16:00 - 17:00 | 600 | 0 | 0 | 0 |
| 22.02.2021 17:00 - 18:00 | 600 | 0 | 0 | 0 |
| 22.02.2021 18:00 - 19:00 | 600 | 0 | 0 | 0 |
| 22.02.2021 19:00 - 20:00 | 900 | 0 | 0 | 0 |
| 22.02.2021 20:00 - 21:00 | 900 | 0 | 0 | 0 |
| 22.02.2021 21:00 - 22:00 | 900 | 0 | 0 | 0 |
| 22.02.2021 22:00 - 23:00 | 900 | 0 | 0 | 0 |
| 22.02.2021 23:00 - 24:00 | 1400 | 0 | 0 | 0 |
| 23.02.2021 00:00 - 01:00 | 1400 | 0 | 0 | 0 |
| 23.02.2021 01:00 - 02:00 | 1900 | 0 | 0 | 0 |
| 23.02.2021 02:00 - 03:00 | 1900 | 0 | 0 | 0 |
| 23.02.2021 03:00 - 04:00 | 2400 | 0 | 0 | 0 |
| 23.02.2021 04:00 - 05:00 | 2400 | 0 | 0 | 0 |
| 23.02.2021 05:00 - 06:00 | 2400 | 0 | 0 | 0 |
| 23.02.2021 06:00 - 07:00 | 0 | 0 | 0 | 0 |
| 23.02.2021 07:00 - 08:00 | 0 | 0 | 0 | 0 |
| 23.02.2021 08:00 - 09:00 | 300 | 0 | 0 | 0 |
| 23.02.2021 09:00 - 10:00 | 300 | 0 | 0 | 0 |
| 23.02.2021 10:00 - 11:00 | 300 | 0 | 0 | 0 |
| 23.02.2021 11:00 - 12:00 | 300 | 0 | 0 | 0 |
| 23.02.2021 12:00 - 13:00 | 300 | 0 | 0 | 0 |
| 23.02.2021 13:00 - 14:00 | 300 | 0 | 0 | 0 |
| 23.02.2021 14:00 - 15:00 | 700 | 0 | 0 | 0 |
| 23.02.2021 15:00 - 16:00 | 700 | 0 | 0 | 0 |
| 23.02.2021 16:00 - 17:00 | 700 | 0 | 0 | 0 |
| 23.02.2021 17:00 - 18:00 | 700 | 0 | 0 | 0 |
| 23.02.2021 18:00 - 19:00 | 700 | 0 | 0 | 0 |
| 23.02.2021 19:00 - 20:00 | 700 | 0 | 0 | 0 |
| 23.02.2021 20:00 - 21:00 | 700 | 0 | 0 | 0 |
| 23.02.2021 21:00 - 22:00 | 700 | 0 | 0 | 0 |
| 23.02.2021 22:00 - 23:00 | 700 | 0 | 0 | 0 |
| 23.02.2021 23:00 - 24:00 | 700 | 0 | 0 | 0 |
| 24.02.2021 00:00 - 01:00 | 700 | 0 | 0 | 0 |
| 24.02.2021 01:00 - 02:00 | 700 | 0 | 0 | 0 |
| 24.02.2021 02:00 - 03:00 | 700 | 0 | 0 | 0 |
| 24.02.2021 03:00 - 04:00 | 1500 | 0 | 0 | 0 |
| 24.02.2021 04:00 - 05:00 | 1500 | 0 | 0 | 0 |
| 24.02.2021 05:00 - 06:00 | 1500 | 0 | 0 | 0 |
| 24.02.2021 06:00 - 07:00 | 0 | 0 | 0 | 0 |
| 24.02.2021 07:00 - 08:00 | 0 | 0 | 0 | 0 |
| 24.02.2021 08:00 - 09:00 | 300 | 0 | 0 | 0 |
| 24.02.2021 09:00 - 10:00 | 300 | 0 | 0 | 0 |
| 24.02.2021 10:00 - 11:00 | 300 | 0 | 0 | 0 |
| 24.02.2021 11:00 - 12:00 | 300 | 0 | 0 | 0 |
| 24.02.2021 12:00 - 13:00 | 300 | 0 | 0 | 0 |
| 24.02.2021 13:00 - 14:00 | 300 | 0 | 0 | 0 |
| 24.02.2021 14:00 - 15:00 | 300 | 0 | 0 | 0 |
| 24.02.2021 15:00 - 16:00 | 500 | 0 | 0 | 0 |
| 24.02.2021 16:00 - 17:00 | 500 | 0 | 0 | 0 |
| 24.02.2021 17:00 - 18:00 | 500 | 0 | 0 | 0 |
| 24.02.2021 18:00 - 19:00 | 500 | 0 | 0 | 0 |
| 24.02.2021 19:00 - 20:00 | 500 | 0 | 0 | 0 |
| 24.02.2021 20:00 - 21:00 | 500 | 0 | 0 | 0 |
| 24.02.2021 21:00 - 22:00 | 500 | 0 | 0 | 0 |
| 24.02.2021 22:00 - 23:00 | 500 | 0 | 0 | 0 |
| 24.02.2021 23:00 - 24:00 | 500 | 0 | 0 | 0 |
| 25.02.2021 00:00 - 01:00 | 500 | 0 | 0 | 0 |
| 25.02.2021 01:00 - 02:00 | 500 | 0 | 0 | 0 |
| 25.02.2021 02:00 - 03:00 | 500 | 0 | 0 | 0 |
| 25.02.2021 03:00 - 04:00 | 500 | 0 | 0 | 0 |
| 25.02.2021 04:00 - 05:00 | 500 | 0 | 0 | 0 |
| 25.02.2021 05:00 - 06:00 | 500 | 0 | 0 | 0 |
| 25.02.2021 06:00 - 07:00 | 0 | 0 | 0 | 0 |
| 25.02.2021 07:00 - 08:00 | 0 | 0 | 0 | 0 |
| 25.02.2021 08:00 - 09:00 | 0 | 0 | 0 | 0 |
| 25.02.2021 09:00 - 10:00 | 0 | 0 | 0 | 0 |
| 25.02.2021 10:00 - 11:00 | 0 | 0 | 0 | 0 |
| 25.02.2021 11:00 - 12:00 | 300 | 0 | 0 | 0 |
| 25.02.2021 12:00 - 13:00 | 300 | 0 | 0 | 0 |
| 25.02.2021 13:00 - 14:00 | 300 | 0 | 0 | 0 |
| 25.02.2021 14:00 - 15:00 | 300 | 0 | 0 | 0 |
| 25.02.2021 15:00 - 16:00 | 300 | 0 | 0 | 0 |
| 25.02.2021 16:00 - 17:00 | 300 | 0 | 0 | 0 |
| 25.02.2021 17:00 - 18:00 | 300 | 0 | 0 | 0 |
| 25.02.2021 18:00 - 19:00 | 300 | 0 | 0 | 0 |
| 25.02.2021 19:00 - 20:00 | 300 | 0 | 0 | 0 |
| 25.02.2021 20:00 - 21:00 | 300 | 0 | 0 | 0 |
| 25.02.2021 21:00 - 22:00 | 300 | 0 | 0 | 0 |
| 25.02.2021 22:00 - 23:00 | 300 | 0 | 0 | 0 |
| 25.02.2021 23:00 - 24:00 | 300 | 0 | 0 | 0 |
| 26.02.2021 00:00 - 01:00 | 300 | 0 | 0 | 0 |
| 26.02.2021 01:00 - 02:00 | 300 | 0 | 0 | 0 |
| 26.02.2021 02:00 - 03:00 | 300 | 0 | 0 | 0 |
| 26.02.2021 03:00 - 04:00 | 300 | 0 | 0 | 0 |
| 26.02.2021 04:00 - 05:00 | 300 | 0 | 0 | 0 |
| 26.02.2021 05:00 - 06:00 | 300 | 0 | 0 | 0 |
| 26.02.2021 06:00 - 07:00 | 0 | 0 | 0 | 0 |
| 26.02.2021 07:00 - 08:00 | 0 | 0 | 0 | 0 |
| 26.02.2021 08:00 - 09:00 | 0 | 0 | 0 | 0 |
| 26.02.2021 09:00 - 10:00 | 0 | 0 | 0 | 0 |
| 26.02.2021 10:00 - 11:00 | 0 | 0 | 0 | 0 |
| 26.02.2021 11:00 - 12:00 | 0 | 0 | 0 | 0 |
| 26.02.2021 12:00 - 13:00 | 0 | 0 | 0 | 0 |
| 26.02.2021 13:00 - 14:00 | 0 | 0 | 0 | 0 |
| 26.02.2021 14:00 - 15:00 | 0 | 0 | 0 | 0 |
| 26.02.2021 15:00 - 16:00 | 0 | 0 | 0 | 0 |
| 26.02.2021 16:00 - 17:00 | 0 | 0 | 0 | 0 |
| 26.02.2021 17:00 - 18:00 | 0 | 0 | 0 | 0 |
| 26.02.2021 18:00 - 19:00 | 0 | 0 | 0 | 0 |
| 26.02.2021 19:00 - 20:00 | 0 | 0 | 0 | 0 |
| 26.02.2021 20:00 - 21:00 | 0 | 0 | 0 | 0 |
| 26.02.2021 21:00 - 22:00 | 0 | 0 | 0 | 0 |
| 26.02.2021 22:00 - 23:00 | 0 | 0 | 0 | 0 |
| 26.02.2021 23:00 - 24:00 | 0 | 0 | 0 | 0 |
| 27.02.2021 00:00 - 01:00 | 0 | -400 | 0 | 0 |
| 27.02.2021 01:00 - 02:00 | 0 | -400 | 0 | 0 |
| 27.02.2021 02:00 - 03:00 | 0 | -400 | 0 | 0 |
| 27.02.2021 03:00 - 04:00 | 0 | -400 | 0 | 0 |
| 27.02.2021 04:00 - 05:00 | 0 | -400 | 0 | 0 |
| 27.02.2021 05:00 - 06:00 | 0 | -400 | 0 | 0 |
| 27.02.2021 06:00 - 07:00 | 0 | 0 | 0 | 0 |
| 27.02.2021 07:00 - 08:00 | 0 | 0 | 0 | 0 |
| 27.02.2021 08:00 - 09:00 | 0 | 0 | 0 | 0 |
| 27.02.2021 09:00 - 10:00 | 0 | 0 | 0 | 0 |
| 27.02.2021 10:00 - 11:00 | 0 | 0 | 0 | 0 |
| 27.02.2021 11:00 - 12:00 | 0 | 0 | 0 | 0 |
| 27.02.2021 12:00 - 13:00 | 0 | 0 | 0 | 0 |
| 27.02.2021 13:00 - 14:00 | 0 | 0 | 0 | 0 |
| 27.02.2021 14:00 - 15:00 | 0 | 0 | 0 | 0 |
| 27.02.2021 15:00 - 16:00 | 0 | 0 | 0 | 0 |
| 27.02.2021 16:00 - 17:00 | 0 | 0 | 0 | 0 |
| 27.02.2021 17:00 - 18:00 | 0 | 0 | 0 | 0 |
| 27.02.2021 18:00 - 19:00 | 0 | 0 | 0 | 0 |
| 27.02.2021 19:00 - 20:00 | 0 | 0 | 0 | 0 |
| 27.02.2021 20:00 - 21:00 | 0 | 0 | 0 | 0 |
| 27.02.2021 21:00 - 22:00 | 0 | 0 | 0 | 0 |
| 27.02.2021 22:00 - 23:00 | 0 | 0 | 0 | 0 |
| 27.02.2021 23:00 - 24:00 | 0 | 0 | 0 | 0 |
| 28.02.2021 00:00 - 01:00 | 300 | 0 | 0 | 0 |
| 28.02.2021 01:00 - 02:00 | 300 | 0 | 0 | 0 |
| 28.02.2021 02:00 - 03:00 | 300 | 0 | 0 | 0 |
| 28.02.2021 03:00 - 04:00 | 300 | 0 | 0 | 0 |
| 28.02.2021 04:00 - 05:00 | 300 | 0 | 0 | 0 |
| 28.02.2021 05:00 - 06:00 | 300 | 0 | 0 | 0 |
| 28.02.2021 06:00 - 07:00 | 0 | 0 | 0 | 0 |
| 28.02.2021 07:00 - 08:00 | 0 | 0 | 0 | 0 |
| 28.02.2021 08:00 - 09:00 | 0 | 0 | 0 | 0 |
| 28.02.2021 09:00 - 10:00 | 0 | 0 | 0 | 0 |
| 28.02.2021 10:00 - 11:00 | 0 | 0 | 0 | 0 |
| 28.02.2021 11:00 - 12:00 | 0 | 0 | 0 | 0 |
| 28.02.2021 12:00 - 13:00 | 0 | 0 | 0 | 0 |
| 28.02.2021 13:00 - 14:00 | 0 | 0 | 0 | 0 |
| 28.02.2021 14:00 - 15:00 | 0 | 0 | 0 | 0 |
| 28.02.2021 15:00 - 16:00 | 0 | 0 | 0 | 0 |
| 28.02.2021 16:00 - 17:00 | 0 | 0 | 0 | 0 |
| 28.02.2021 17:00 - 18:00 | 0 | 0 | 0 | 0 |
| 28.02.2021 18:00 - 19:00 | 0 | 0 | 0 | 0 |
| 28.02.2021 19:00 - 20:00 | 0 | 0 | 0 | 0 |
| 28.02.2021 20:00 - 21:00 | 0 | 0 | 0 | 0 |
| 28.02.2021 21:00 - 22:00 | 0 | 0 | 0 | 0 |
| 28.02.2021 22:00 - 23:00 | 0 | 0 | 0 | 0 |
| 28.02.2021 23:00 - 24:00 | 0 | 0 | 0 | 0 |
| 01.03.2021 00:00 - 01:00 | 0 | 0 | 0 | 0 |
| 01.03.2021 01:00 - 02:00 | 0 | 0 | 0 | 0 |
| 01.03.2021 02:00 - 03:00 | 0 | 0 | 0 | 0 |
| 01.03.2021 03:00 - 04:00 | 0 | 0 | 0 | 0 |
| 01.03.2021 04:00 - 05:00 | 0 | 0 | 0 | 0 |
| 01.03.2021 05:00 - 06:00 | 0 | 0 | 0 | 0 |